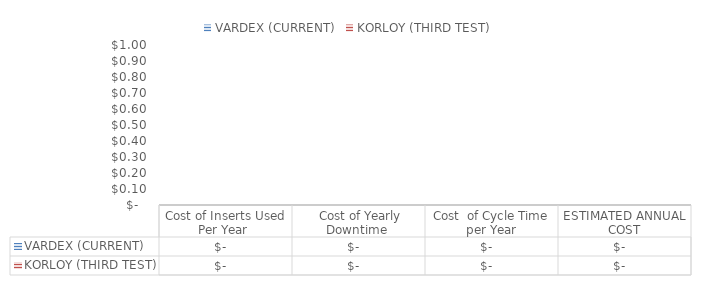
| Category | VARDEX (CURRENT) | KORLOY (THIRD TEST) |
|---|---|---|
| Cost of Inserts Used Per Year  | 0 | 0 |
|  Cost of Yearly Downtime  | 0 | 0 |
| Cost  of Cycle Time per Year | 0 | 0 |
| ESTIMATED ANNUAL COST | 0 | 0 |